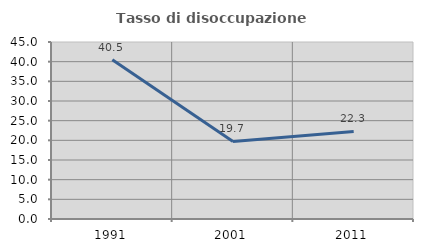
| Category | Tasso di disoccupazione giovanile  |
|---|---|
| 1991.0 | 40.476 |
| 2001.0 | 19.706 |
| 2011.0 | 22.269 |